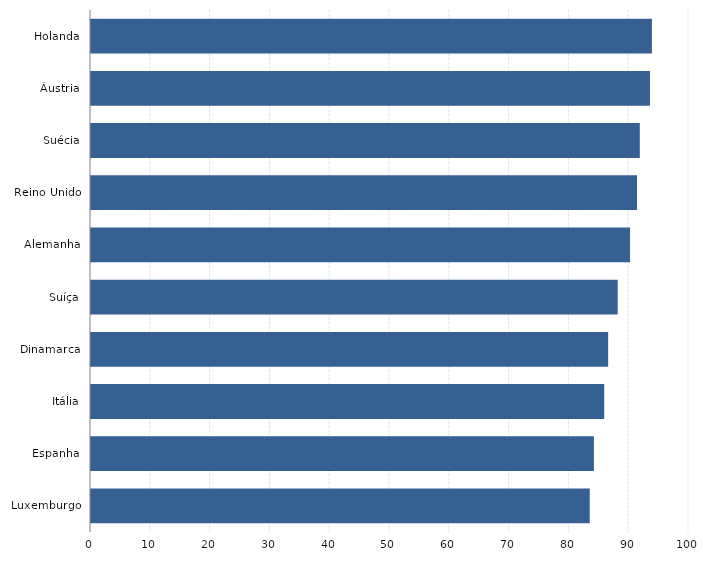
| Category | Series 0 |
|---|---|
| Luxemburgo | 83.402 |
| Espanha | 84.1 |
| Itália | 85.821 |
| Dinamarca | 86.479 |
| Suíça | 88.078 |
| Alemanha | 90.143 |
| Reino Unido | 91.309 |
| Suécia | 91.773 |
| Áustria | 93.476 |
| Holanda | 93.801 |